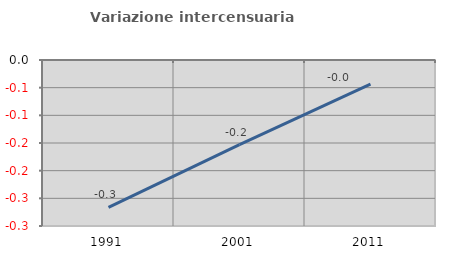
| Category | Variazione intercensuaria annua |
|---|---|
| 1991.0 | -0.266 |
| 2001.0 | -0.153 |
| 2011.0 | -0.043 |